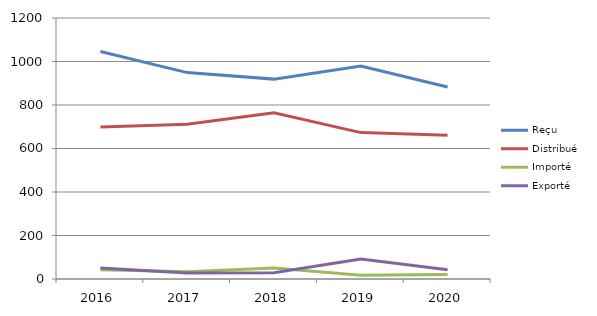
| Category | Reçu | Distribué | Importé | Exporté |
|---|---|---|---|---|
| 2016.0 | 1046 | 699 | 42 | 51 |
| 2017.0 | 949 | 712 | 33 | 28 |
| 2018.0 | 919 | 764 | 50 | 29 |
| 2019.0 | 979 | 673 | 17 | 92 |
| 2020.0 | 883 | 661 | 21 | 43 |